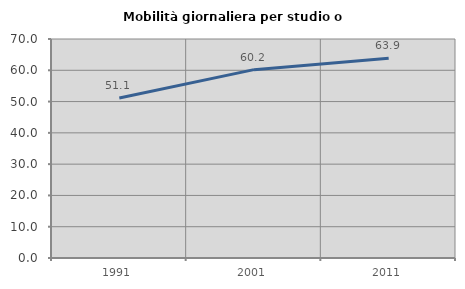
| Category | Mobilità giornaliera per studio o lavoro |
|---|---|
| 1991.0 | 51.145 |
| 2001.0 | 60.204 |
| 2011.0 | 63.861 |